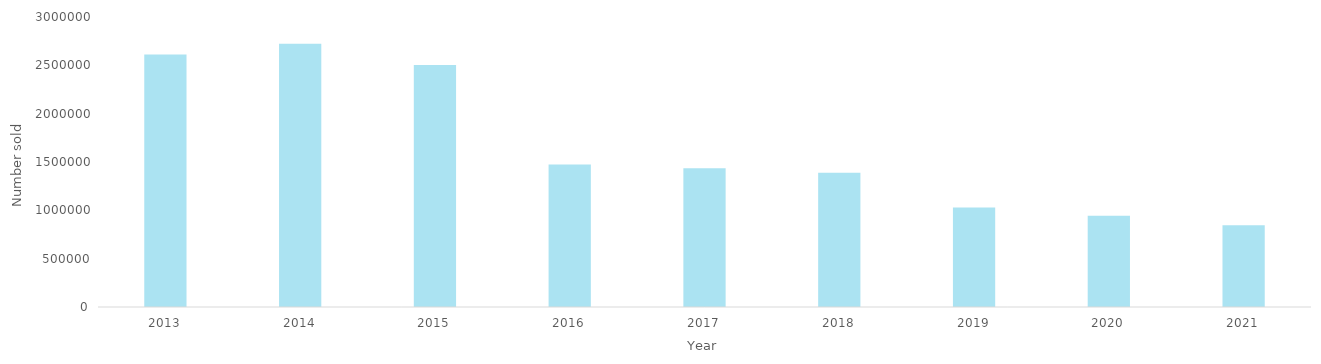
| Category | Series 0 |
|---|---|
| 2013.0 | 2612134 |
| 2014.0 | 2724302 |
| 2015.0 | 2502415 |
| 2016.0 | 1473389 |
| 2017.0 | 1436164 |
| 2018.0 | 1387584 |
| 2019.0 | 1030319 |
| 2020.0 | 942946 |
| 2021.0 | 846677 |